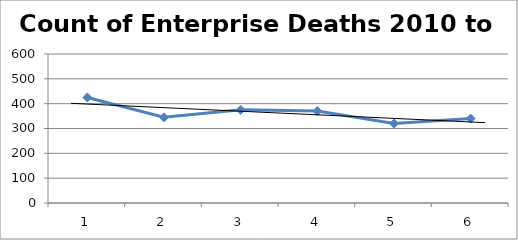
| Category | Series 0 |
|---|---|
| 0 | 425 |
| 1 | 345 |
| 2 | 375 |
| 3 | 370 |
| 4 | 320 |
| 5 | 340 |